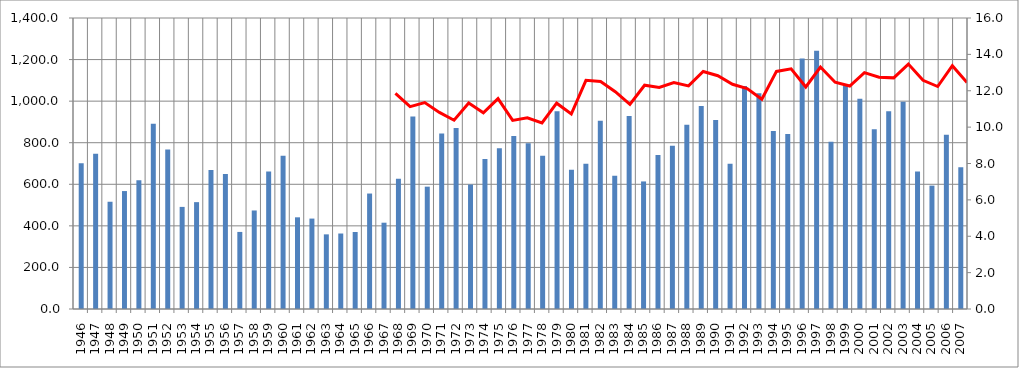
| Category | Series 0 |
|---|---|
| 1946.0 | 700.9 |
| 1947.0 | 747.4 |
| 1948.0 | 516 |
| 1949.0 | 567.4 |
| 1950.0 | 618.9 |
| 1951.0 | 891.5 |
| 1952.0 | 767 |
| 1953.0 | 491.2 |
| 1954.0 | 514.1 |
| 1955.0 | 668.9 |
| 1956.0 | 649.3 |
| 1957.0 | 370.8 |
| 1958.0 | 474 |
| 1959.0 | 661 |
| 1960.0 | 737.3 |
| 1961.0 | 441.1 |
| 1962.0 | 435 |
| 1963.0 | 359.1 |
| 1964.0 | 363.2 |
| 1965.0 | 370.4 |
| 1966.0 | 555.5 |
| 1967.0 | 415.2 |
| 1968.0 | 626.6 |
| 1969.0 | 925.8 |
| 1970.0 | 588.6 |
| 1971.0 | 843.9 |
| 1972.0 | 871 |
| 1973.0 | 598.8 |
| 1974.0 | 722 |
| 1975.0 | 773.7 |
| 1976.0 | 832 |
| 1977.0 | 797.4 |
| 1978.0 | 736.8 |
| 1979.0 | 951.7 |
| 1980.0 | 669.9 |
| 1981.0 | 698.5 |
| 1982.0 | 905.7 |
| 1983.0 | 640.7 |
| 1984.0 | 928.8 |
| 1985.0 | 613.7 |
| 1986.0 | 741 |
| 1987.0 | 785.6 |
| 1988.0 | 886.7 |
| 1989.0 | 976.9 |
| 1990.0 | 909.7 |
| 1991.0 | 699 |
| 1992.0 | 1073 |
| 1993.0 | 1038 |
| 1994.0 | 856.6 |
| 1995.0 | 841.5 |
| 1996.0 | 1205.3 |
| 1997.0 | 1242.7 |
| 1998.0 | 804.9 |
| 1999.0 | 1076.3 |
| 2000.0 | 1011.8 |
| 2001.0 | 865 |
| 2002.0 | 951.2 |
| 2003.0 | 997.5 |
| 2004.0 | 661.5 |
| 2005.0 | 593.5 |
| 2006.0 | 838.7 |
| 2007.0 | 682 |